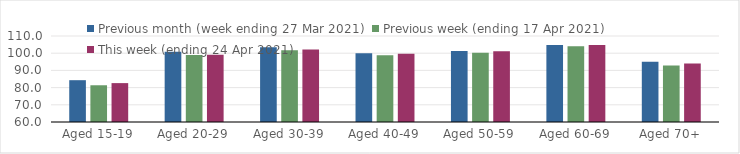
| Category | Previous month (week ending 27 Mar 2021) | Previous week (ending 17 Apr 2021) | This week (ending 24 Apr 2021) |
|---|---|---|---|
| Aged 15-19 | 84.31 | 81.36 | 82.61 |
| Aged 20-29 | 100.79 | 98.9 | 99.07 |
| Aged 30-39 | 103.45 | 101.74 | 102.12 |
| Aged 40-49 | 99.98 | 98.83 | 99.64 |
| Aged 50-59 | 101.34 | 100.31 | 101.17 |
| Aged 60-69 | 104.72 | 103.98 | 104.83 |
| Aged 70+ | 95 | 92.83 | 94.03 |